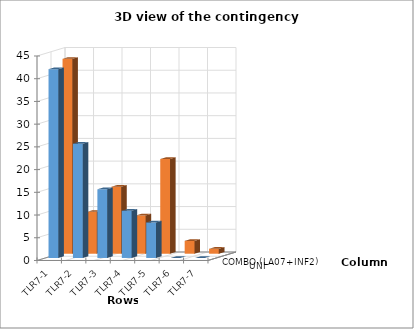
| Category | UNI | COMBO (LA07+INF2) |
|---|---|---|
| TLR7-1 | 41.542 | 42.888 |
| TLR7-2 | 25.155 | 9.211 |
| TLR7-3 | 15.112 | 14.743 |
| TLR7-4 | 10.386 | 8.41 |
| TLR7-5 | 7.805 | 20.838 |
| TLR7-6 | 0 | 2.821 |
| TLR7-7 | 0 | 1.088 |